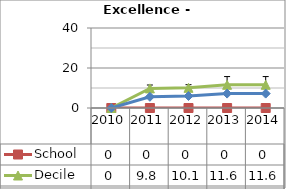
| Category | School  | Decile | National |
|---|---|---|---|
| 2010.0 | 0 | 0 | 0 |
| 2011.0 | 0 | 9.8 | 5.6 |
| 2012.0 | 0 | 10.1 | 6 |
| 2013.0 | 0 | 11.6 | 7.2 |
| 2014.0 | 0 | 11.6 | 7.2 |